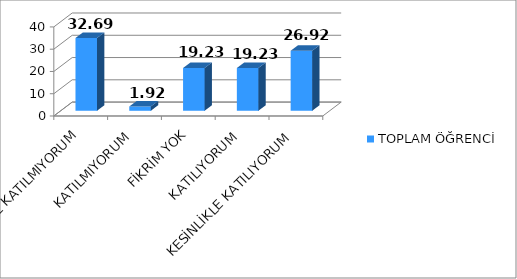
| Category | TOPLAM ÖĞRENCİ |
|---|---|
| KESİNLİKLE KATILMIYORUM | 32.69 |
| KATILMIYORUM | 1.92 |
| FİKRİM YOK | 19.23 |
| KATILIYORUM | 19.23 |
| KESİNLİKLE KATILIYORUM | 26.92 |